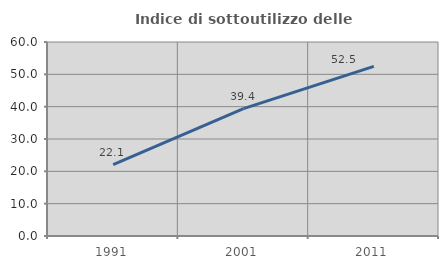
| Category | Indice di sottoutilizzo delle abitazioni  |
|---|---|
| 1991.0 | 22.059 |
| 2001.0 | 39.394 |
| 2011.0 | 52.459 |